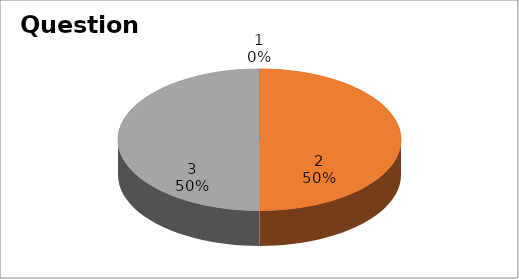
| Category | Series 0 |
|---|---|
| 0 | 0 |
| 1 | 10 |
| 2 | 10 |